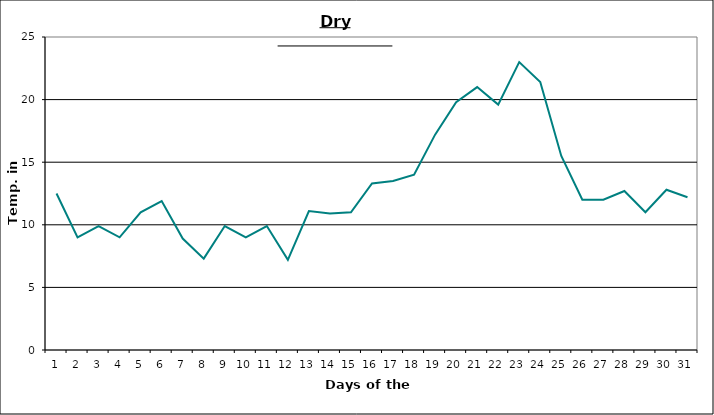
| Category | Series 0 |
|---|---|
| 0 | 12.5 |
| 1 | 9 |
| 2 | 9.9 |
| 3 | 9 |
| 4 | 11 |
| 5 | 11.9 |
| 6 | 8.9 |
| 7 | 7.3 |
| 8 | 9.9 |
| 9 | 9 |
| 10 | 9.9 |
| 11 | 7.2 |
| 12 | 11.1 |
| 13 | 10.9 |
| 14 | 11 |
| 15 | 13.3 |
| 16 | 13.5 |
| 17 | 14 |
| 18 | 17.2 |
| 19 | 19.8 |
| 20 | 21 |
| 21 | 19.6 |
| 22 | 23 |
| 23 | 21.4 |
| 24 | 15.5 |
| 25 | 12 |
| 26 | 12 |
| 27 | 12.7 |
| 28 | 11 |
| 29 | 12.8 |
| 30 | 12.2 |